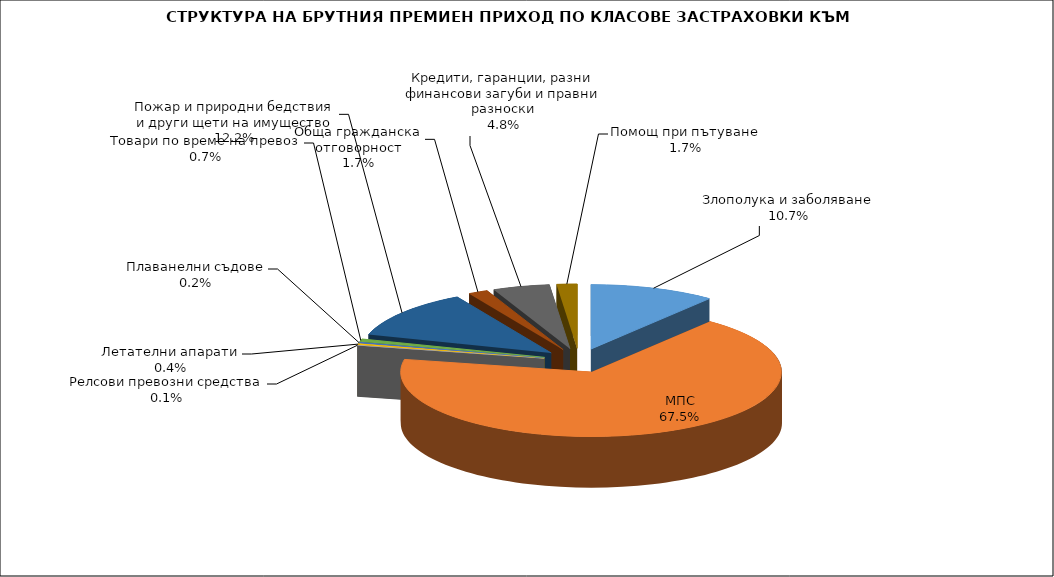
| Category | Злополука и заболяване |
|---|---|
| Злополука и заболяване | 0.107 |
| МПС | 0.675 |
| Релсови превозни средства | 0.001 |
| Летателни апарати | 0.004 |
| Плаванелни съдове | 0.002 |
| Товари по време на превоз | 0.007 |
| Пожар и природни бедствия и други щети на имущество | 0.122 |
| Обща гражданска отговорност | 0.017 |
| Кредити, гаранции, разни финансови загуби и правни разноски | 0.048 |
| Помощ при пътуване | 0.017 |